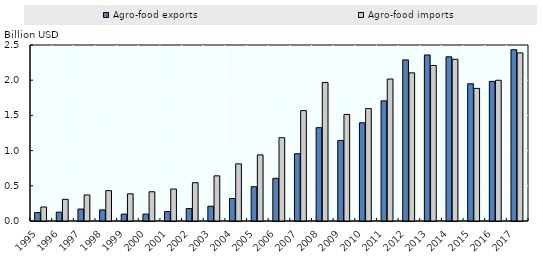
| Category | Agro-food exports | Agro-food imports |
|---|---|---|
| 1995.0 | 0.119 | 0.199 |
| 1996.0 | 0.126 | 0.308 |
| 1997.0 | 0.169 | 0.369 |
| 1998.0 | 0.158 | 0.432 |
| 1999.0 | 0.097 | 0.386 |
| 2000.0 | 0.098 | 0.415 |
| 2001.0 | 0.134 | 0.455 |
| 2002.0 | 0.177 | 0.544 |
| 2003.0 | 0.21 | 0.642 |
| 2004.0 | 0.319 | 0.811 |
| 2005.0 | 0.487 | 0.939 |
| 2006.0 | 0.606 | 1.183 |
| 2007.0 | 0.956 | 1.568 |
| 2008.0 | 1.326 | 1.968 |
| 2009.0 | 1.145 | 1.514 |
| 2010.0 | 1.395 | 1.597 |
| 2011.0 | 1.707 | 2.016 |
| 2012.0 | 2.289 | 2.104 |
| 2013.0 | 2.359 | 2.209 |
| 2014.0 | 2.332 | 2.297 |
| 2015.0 | 1.949 | 1.884 |
| 2016.0 | 1.983 | 1.999 |
| 2017.0 | 2.433 | 2.388 |